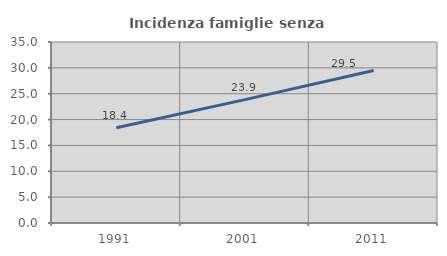
| Category | Incidenza famiglie senza nuclei |
|---|---|
| 1991.0 | 18.416 |
| 2001.0 | 23.857 |
| 2011.0 | 29.504 |